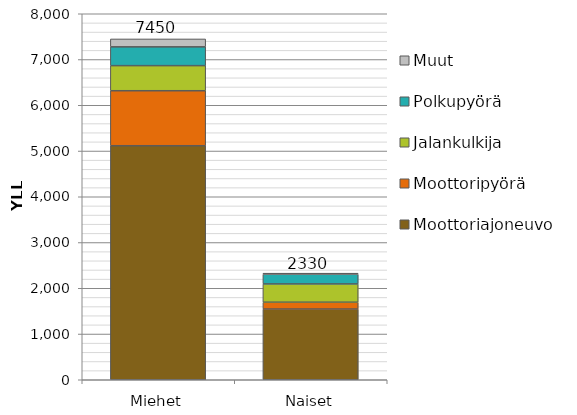
| Category | Moottoriajoneuvo | Moottoripyörä | Jalankulkija | Polkupyörä | Muut |
|---|---|---|---|---|---|
| Miehet | 5115.267 | 1202.101 | 548.568 | 410.705 | 173.039 |
| Naiset | 1545.783 | 149.02 | 399.565 | 213.627 | 21.38 |